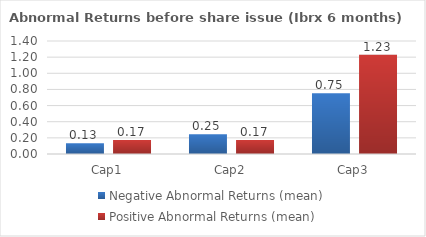
| Category | Negative Abnormal Returns (mean) | Positive Abnormal Returns (mean) |
|---|---|---|
| Cap1 | 0.134 | 0.172 |
| Cap2 | 0.245 | 0.173 |
| Cap3 | 0.753 | 1.229 |